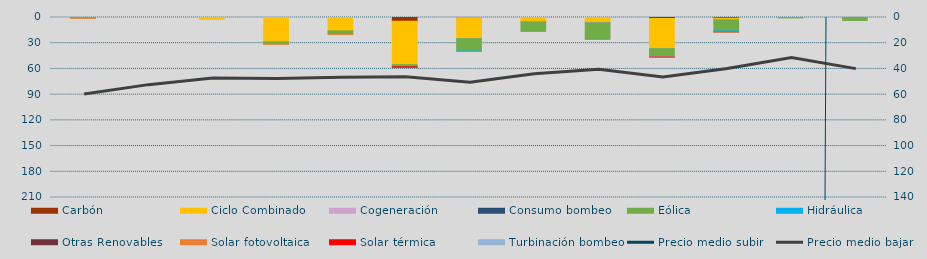
| Category | Carbón | Ciclo Combinado | Cogeneración | Consumo bombeo | Eólica | Hidráulica | Otras Renovables | Solar fotovoltaica | Solar térmica | Turbinación bombeo |
|---|---|---|---|---|---|---|---|---|---|---|
| 0 | 0 | 0 | 0 |  | 757.3 | 0 | 0 | 12.2 | 0 | 0 |
| 1 | 0 | 0 | 0 |  | 0 | 0 | 0 | 0 | 0 | 0 |
| 2 | 0 | 2002 | 0 |  | 0 | 0 | 0 | 0 | 0 | 0 |
| 3 | 0 | 28154.5 | 304 |  | 2598.1 | 70.2 | 0 | 87.1 | 0 | 0 |
| 4 | 0 | 15599.6 | 0 |  | 3217.5 | 555 | 0 | 406.6 | 0 | 0 |
| 5 | 4394.5 | 50553 | 0 |  | 2251 | 0 | 467 | 33.2 | 196 | 0 |
| 6 | 167 | 24469.7 | 4.5 |  | 14472.2 | 627.8 | 0 | 21.8 | 0 | 0 |
| 7 | 0 | 4989.5 | 0 |  | 11218.3 | 8.9 | 0 | 0 | 0 | 0 |
| 8 | 0 | 5246.6 | 891.5 |  | 19357.7 | 73 | 0 | 0 | 0 | 0 |
| 9 | 1161 | 34847 | 340.9 |  | 9473.4 | 120 | 0 | 21.4 | 39.8 | 400 |
| 10 | 846 | 1898.8 | 0 |  | 12932.4 | 1173 | 80 | 33 | 0 | 0 |
| 11 | 0 | 0 | 0 |  | 464.6 | 0 | 0 | 0 | 0 | 0 |
| 12 | 0 | 0 | 0 |  | 3444.7 | 0 | 0 | 0 | 0 | 0 |